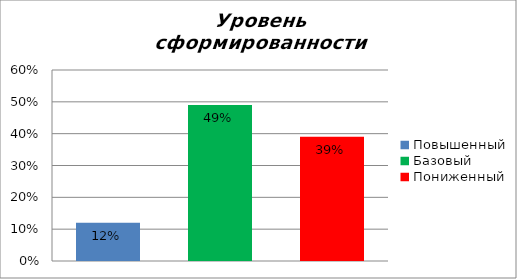
| Category | Уровень сформированности предметных результатов |
|---|---|
| Повышенный | 0.12 |
| Базовый | 0.49 |
| Пониженный | 0.39 |